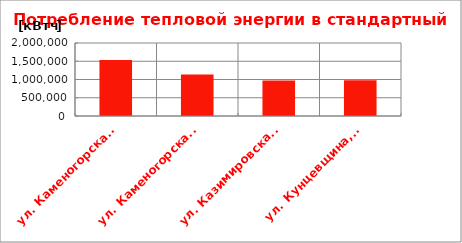
| Category | Series 0 |
|---|---|
| ул. Каменогорская, 30 | 1530921.6 |
| ул. Каменогорская, 86 | 1134317.6 |
| ул. Казимировская, 9 | 973240 |
| ул. Кунцевщина, 35 | 981429.6 |